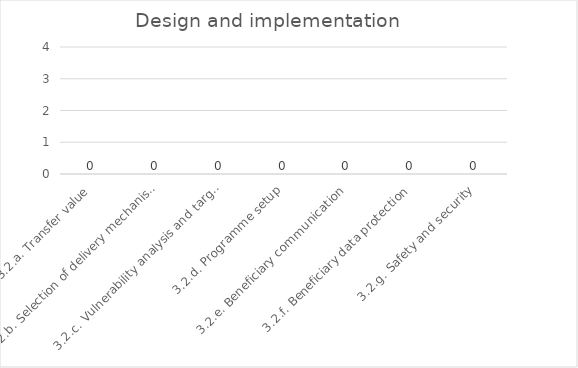
| Category | Design and implementation |
|---|---|
| 3.2.a. Transfer value | 0 |
| 3.2.b. Selection of delivery mechanism | 0 |
| 3.2.c. Vulnerability analysis and targeting | 0 |
| 3.2.d. Programme setup | 0 |
| 3.2.e. Beneficiary communication | 0 |
| 3.2.f. Beneficiary data protection | 0 |
| 3.2.g. Safety and security | 0 |